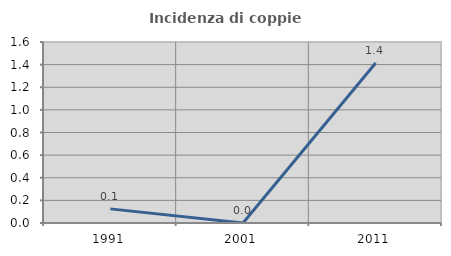
| Category | Incidenza di coppie miste |
|---|---|
| 1991.0 | 0.125 |
| 2001.0 | 0 |
| 2011.0 | 1.414 |